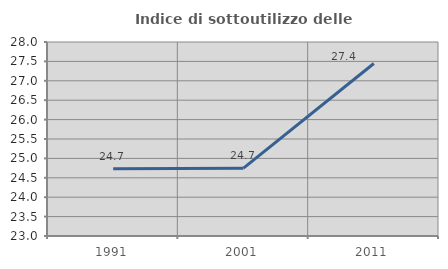
| Category | Indice di sottoutilizzo delle abitazioni  |
|---|---|
| 1991.0 | 24.734 |
| 2001.0 | 24.747 |
| 2011.0 | 27.446 |